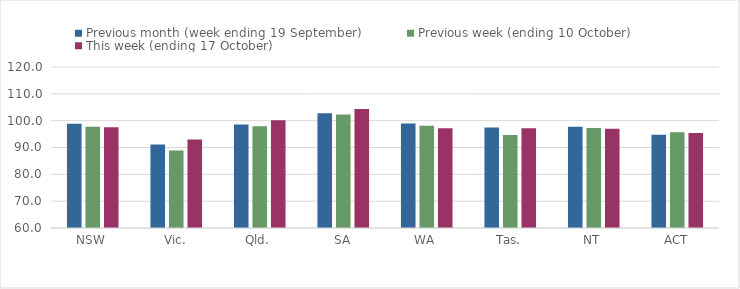
| Category | Previous month (week ending 19 September) | Previous week (ending 10 October) | This week (ending 17 October) |
|---|---|---|---|
| NSW | 98.81 | 97.76 | 97.53 |
| Vic. | 91.1 | 88.85 | 92.96 |
| Qld. | 98.57 | 97.89 | 100.15 |
| SA | 102.78 | 102.27 | 104.31 |
| WA | 98.91 | 98.07 | 97.15 |
| Tas. | 97.48 | 94.65 | 97.13 |
| NT | 97.73 | 97.3 | 97 |
| ACT | 94.79 | 95.7 | 95.38 |